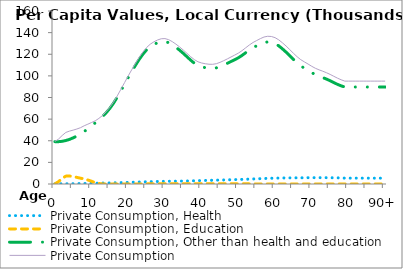
| Category | Private Consumption, Health | Private Consumption, Education | Private Consumption, Other than health and education | Private Consumption |
|---|---|---|---|---|
| 0 | 132.12 | 0 | 39146.365 | 39278.481 |
|  | 173.112 | 2210.748 | 39149.257 | 41533.12 |
| 2 | 207.085 | 5188.066 | 39485.946 | 44881.096 |
| 3 | 233.308 | 7277.022 | 40205.659 | 47715.992 |
| 4 | 261.663 | 7382.654 | 41279.14 | 48923.454 |
| 5 | 300.655 | 6854.055 | 42679.979 | 49834.686 |
| 6 | 352.967 | 6126.857 | 44374.653 | 50854.475 |
| 7 | 416.089 | 5335.829 | 46342.416 | 52094.333 |
| 8 | 485.363 | 4803.953 | 48579.197 | 53868.518 |
| 9 | 557.204 | 3738.792 | 51038.318 | 55334.314 |
| 10 | 630.366 | 2553.17 | 53690.654 | 56874.196 |
| 11 | 705.025 | 1223.863 | 56495.447 | 58424.334 |
| 12 | 782.309 | 504.412 | 59395.556 | 60682.285 |
| 13 | 862.63 | 21.087 | 62481.702 | 63365.422 |
| 14 | 946.022 | 10.112 | 65929.455 | 66885.589 |
| 15 | 1032.046 | 18.685 | 69997.813 | 71048.537 |
| 16 | 1121.153 | 0 | 74763.767 | 75884.918 |
| 17 | 1213.342 | 0 | 80242.35 | 81455.698 |
| 18 | 1309.221 | 2.57 | 86249.185 | 87560.977 |
| 19 | 1409.575 | 11.408 | 92373.269 | 93794.248 |
| 20 | 1513.874 | 21.211 | 98450.39 | 99985.473 |
| 21 | 1621.117 | 33.186 | 104340.737 | 105995.041 |
| 22 | 1730.908 | 48.128 | 109997.767 | 111776.804 |
| 23 | 1842.162 | 66.308 | 115321.312 | 117229.746 |
| 24 | 1952.723 | 87.344 | 120088.76 | 122128.834 |
| 25 | 2059.61 | 110.683 | 124066.674 | 126236.981 |
| 26 | 2159.977 | 135.742 | 127024.806 | 129320.527 |
| 27 | 2251.051 | 161.68 | 129105.932 | 131518.705 |
| 28 | 2331.994 | 187.817 | 130691.143 | 133210.942 |
| 29 | 2402.493 | 213.416 | 131705.484 | 134321.376 |
| 30 | 2462.714 | 237.661 | 131789.848 | 134490.176 |
| 31 | 2514.62 | 259.859 | 130713.661 | 133488.15 |
| 32 | 2561.526 | 279.701 | 128823.504 | 131664.7 |
| 33 | 2607.483 | 297.04 | 126419.989 | 129324.538 |
| 34 | 2659.568 | 311.732 | 123755.274 | 126726.535 |
| 35 | 2723.869 | 323.639 | 120831.576 | 123879.057 |
| 36 | 2802.027 | 332.782 | 117688.193 | 120823.014 |
| 37 | 2891.835 | 339.164 | 114559.208 | 117790.234 |
| 38 | 2989.459 | 342.703 | 111705.088 | 115037.297 |
| 39 | 3091.718 | 343.327 | 109612.723 | 113047.764 |
| 40 | 3193.155 | 340.969 | 108383.194 | 111917.321 |
| 41 | 3289.503 | 335.685 | 107601.594 | 111226.778 |
| 42 | 3379.427 | 327.564 | 107055.049 | 110762.046 |
| 43 | 3467.523 | 316.651 | 106912.305 | 110696.486 |
| 44 | 3557.578 | 303.076 | 107405.723 | 111266.383 |
| 45 | 3650.306 | 287.096 | 108546.522 | 112483.929 |
| 46 | 3745.854 | 268.92 | 110010.539 | 114025.313 |
| 47 | 3842.994 | 248.726 | 111604.244 | 115695.994 |
| 48 | 3942.477 | 226.67 | 113288.722 | 117457.906 |
| 49 | 4045.073 | 203.236 | 114967.435 | 119215.692 |
| 50 | 4154.134 | 179.219 | 116699.3 | 121032.61 |
| 51 | 4273.915 | 155.451 | 118905.662 | 123335.07 |
| 52 | 4403.57 | 132.713 | 121417.803 | 125954.044 |
| 53 | 4537.969 | 111.663 | 123945.731 | 128595.364 |
| 54 | 4672.592 | 92.456 | 126122.262 | 130887.282 |
| 55 | 4805.547 | 75.135 | 127818.859 | 132699.501 |
| 56 | 4939.515 | 60.097 | 129461.722 | 134461.298 |
| 57 | 5075.473 | 47.865 | 130823.4 | 135946.69 |
| 58 | 5207.889 | 38.8 | 131372.066 | 136618.794 |
| 59 | 5327.506 | 32.744 | 131058.902 | 136419.168 |
| 60 | 5428.87 | 29.072 | 129893.069 | 135351.02 |
| 61 | 5509.987 | 27.232 | 127790.147 | 133327.372 |
| 62 | 5572.044 | 26.789 | 125016.021 | 130614.887 |
| 63 | 5618.872 | 27.078 | 121958.176 | 127604.11 |
| 64 | 5655.388 | 27.857 | 118624.126 | 124307.416 |
| 65 | 5685.58 | 29.096 | 115224.301 | 120938.985 |
| 66 | 5714.764 | 30.684 | 112011.611 | 117757.001 |
| 67 | 5746.675 | 32.421 | 109228.973 | 115008.075 |
| 68 | 5781.447 | 34.278 | 107105.977 | 112921.697 |
| 69 | 5815.845 | 36.282 | 105073.042 | 110925.173 |
| 70 | 5843.484 | 38.439 | 102962.888 | 108844.811 |
| 71 | 5858.673 | 40.76 | 101097.278 | 106996.712 |
| 72 | 5860.745 | 43.276 | 99664.263 | 105568.286 |
| 73 | 5852.028 | 45.972 | 98419.08 | 104317.082 |
| 74 | 5833.168 | 48.726 | 97046.506 | 102928.398 |
| 75 | 5801.656 | 51.202 | 95506.849 | 101359.707 |
| 76 | 5754.966 | 52.874 | 93817.576 | 99625.413 |
| 77 | 5685.815 | 52.978 | 92168.884 | 97907.678 |
| 78 | 5577.281 | 50.477 | 90787.62 | 96415.388 |
| 79 | 5412.771 | 44.057 | 89700.185 | 95157.01 |
| 80 | 5412.771 | 44.057 | 89700.185 | 95157.01 |
| 81 | 5412.771 | 44.057 | 89700.185 | 95157.01 |
| 82 | 5412.771 | 44.057 | 89700.185 | 95157.01 |
| 83 | 5412.771 | 44.057 | 89700.185 | 95157.01 |
| 84 | 5412.771 | 44.057 | 89700.185 | 95157.01 |
| 85 | 5412.771 | 44.057 | 89700.185 | 95157.01 |
| 86 | 5412.771 | 44.057 | 89700.185 | 95157.01 |
| 87 | 5412.771 | 44.057 | 89700.185 | 95157.01 |
| 88 | 5412.771 | 44.057 | 89700.185 | 95157.01 |
| 89 | 5412.771 | 44.057 | 89700.185 | 95157.01 |
| 90+ | 5412.771 | 44.057 | 89700.185 | 95157.01 |